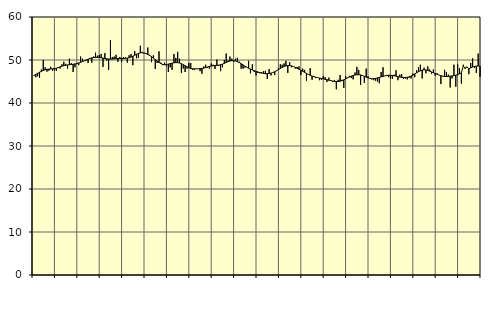
| Category | Piggar | Series 1 |
|---|---|---|
| nan | 46.3 | 46.41 |
| 1.0 | 46 | 46.67 |
| 1.0 | 46.2 | 46.9 |
| 1.0 | 45.9 | 47.15 |
| 1.0 | 47.8 | 47.38 |
| 1.0 | 50 | 47.58 |
| 1.0 | 48.3 | 47.73 |
| 1.0 | 47.3 | 47.82 |
| 1.0 | 47.5 | 47.88 |
| 1.0 | 48.4 | 47.91 |
| 1.0 | 47.5 | 47.94 |
| 1.0 | 47.6 | 48 |
| nan | 47.5 | 48.1 |
| 2.0 | 48.3 | 48.24 |
| 2.0 | 48 | 48.4 |
| 2.0 | 49 | 48.56 |
| 2.0 | 49.6 | 48.69 |
| 2.0 | 49.1 | 48.78 |
| 2.0 | 48 | 48.84 |
| 2.0 | 50.3 | 48.89 |
| 2.0 | 49.3 | 48.94 |
| 2.0 | 47.2 | 49.01 |
| 2.0 | 48.3 | 49.09 |
| 2.0 | 49.3 | 49.19 |
| nan | 48.8 | 49.32 |
| 3.0 | 50.8 | 49.46 |
| 3.0 | 50.3 | 49.64 |
| 3.0 | 49.9 | 49.82 |
| 3.0 | 49.9 | 50 |
| 3.0 | 49.3 | 50.19 |
| 3.0 | 50.3 | 50.36 |
| 3.0 | 49.4 | 50.49 |
| 3.0 | 50.8 | 50.57 |
| 3.0 | 51.7 | 50.61 |
| 3.0 | 51 | 50.62 |
| 3.0 | 51.2 | 50.59 |
| nan | 51.4 | 50.53 |
| 4.0 | 48.4 | 50.45 |
| 4.0 | 51.6 | 50.36 |
| 4.0 | 49.9 | 50.28 |
| 4.0 | 47.7 | 50.23 |
| 4.0 | 54.6 | 50.21 |
| 4.0 | 50.7 | 50.22 |
| 4.0 | 50.8 | 50.26 |
| 4.0 | 51.2 | 50.3 |
| 4.0 | 49.6 | 50.34 |
| 4.0 | 50.7 | 50.37 |
| 4.0 | 49.6 | 50.37 |
| nan | 50.7 | 50.36 |
| 5.0 | 50.6 | 50.38 |
| 5.0 | 49.4 | 50.43 |
| 5.0 | 51.1 | 50.52 |
| 5.0 | 51.4 | 50.68 |
| 5.0 | 48.8 | 50.88 |
| 5.0 | 52.1 | 51.11 |
| 5.0 | 50.4 | 51.34 |
| 5.0 | 50.5 | 51.53 |
| 5.0 | 53.3 | 51.65 |
| 5.0 | 51.9 | 51.69 |
| 5.0 | 51.5 | 51.64 |
| nan | 51.4 | 51.5 |
| 6.0 | 52.9 | 51.3 |
| 6.0 | 51.2 | 51.05 |
| 6.0 | 49.5 | 50.77 |
| 6.0 | 51.1 | 50.45 |
| 6.0 | 47.9 | 50.11 |
| 6.0 | 49.3 | 49.76 |
| 6.0 | 52 | 49.43 |
| 6.0 | 49.4 | 49.16 |
| 6.0 | 48.8 | 48.99 |
| 6.0 | 49.4 | 48.92 |
| 6.0 | 48.5 | 48.95 |
| nan | 47.2 | 49.05 |
| 7.0 | 48.3 | 49.17 |
| 7.0 | 47.7 | 49.27 |
| 7.0 | 51.4 | 49.35 |
| 7.0 | 50.5 | 49.4 |
| 7.0 | 51.9 | 49.38 |
| 7.0 | 50.3 | 49.3 |
| 7.0 | 47 | 49.14 |
| 7.0 | 48 | 48.92 |
| 7.0 | 47.2 | 48.66 |
| 7.0 | 48 | 48.41 |
| 7.0 | 49.3 | 48.19 |
| nan | 49.3 | 48.04 |
| 8.0 | 47.7 | 47.96 |
| 8.0 | 47.7 | 47.94 |
| 8.0 | 47.9 | 47.95 |
| 8.0 | 47.9 | 47.96 |
| 8.0 | 47.4 | 47.99 |
| 8.0 | 46.8 | 48.03 |
| 8.0 | 48.5 | 48.1 |
| 8.0 | 48.9 | 48.23 |
| 8.0 | 48.2 | 48.37 |
| 8.0 | 48 | 48.5 |
| 8.0 | 49.2 | 48.6 |
| nan | 48.9 | 48.67 |
| 9.0 | 47.9 | 48.72 |
| 9.0 | 50.1 | 48.76 |
| 9.0 | 48.6 | 48.81 |
| 9.0 | 47.4 | 48.9 |
| 9.0 | 48.3 | 49.04 |
| 9.0 | 50 | 49.22 |
| 9.0 | 51.5 | 49.43 |
| 9.0 | 49.9 | 49.62 |
| 9.0 | 50.8 | 49.76 |
| 9.0 | 50.3 | 49.84 |
| 9.0 | 49.6 | 49.84 |
| nan | 50.3 | 49.77 |
| 10.0 | 50.5 | 49.62 |
| 10.0 | 49.6 | 49.41 |
| 10.0 | 48 | 49.15 |
| 10.0 | 48 | 48.87 |
| 10.0 | 48.2 | 48.58 |
| 10.0 | 48.3 | 48.32 |
| 10.0 | 49.8 | 48.09 |
| 10.0 | 46.9 | 47.88 |
| 10.0 | 49 | 47.69 |
| 10.0 | 47.2 | 47.52 |
| 10.0 | 46.4 | 47.36 |
| nan | 47 | 47.22 |
| 11.0 | 46.9 | 47.08 |
| 11.0 | 47.2 | 46.96 |
| 11.0 | 47.4 | 46.87 |
| 11.0 | 47.5 | 46.82 |
| 11.0 | 45.6 | 46.82 |
| 11.0 | 47.9 | 46.86 |
| 11.0 | 46.4 | 46.95 |
| 11.0 | 47.1 | 47.09 |
| 11.0 | 46.5 | 47.28 |
| 11.0 | 47.6 | 47.51 |
| 11.0 | 48.1 | 47.77 |
| nan | 49 | 48.04 |
| 12.0 | 48.9 | 48.29 |
| 12.0 | 49.2 | 48.49 |
| 12.0 | 49.8 | 48.63 |
| 12.0 | 47 | 48.71 |
| 12.0 | 49.5 | 48.7 |
| 12.0 | 48.3 | 48.62 |
| 12.0 | 48.5 | 48.48 |
| 12.0 | 48 | 48.29 |
| 12.0 | 48.4 | 48.07 |
| 12.0 | 48.5 | 47.84 |
| 12.0 | 46.5 | 47.61 |
| nan | 48 | 47.37 |
| 13.0 | 47.7 | 47.13 |
| 13.0 | 45.2 | 46.89 |
| 13.0 | 46.7 | 46.66 |
| 13.0 | 48.1 | 46.45 |
| 13.0 | 45.4 | 46.27 |
| 13.0 | 46.3 | 46.11 |
| 13.0 | 45.8 | 45.99 |
| 13.0 | 45.9 | 45.9 |
| 13.0 | 45.3 | 45.81 |
| 13.0 | 45.4 | 45.71 |
| 13.0 | 46.3 | 45.61 |
| nan | 46 | 45.51 |
| 14.0 | 44.9 | 45.41 |
| 14.0 | 45.9 | 45.3 |
| 14.0 | 45.3 | 45.2 |
| 14.0 | 44.9 | 45.11 |
| 14.0 | 45.3 | 45.04 |
| 14.0 | 43.2 | 45.01 |
| 14.0 | 45.4 | 45.01 |
| 14.0 | 46.5 | 45.06 |
| 14.0 | 45.4 | 45.19 |
| 14.0 | 43.5 | 45.38 |
| 14.0 | 46.3 | 45.61 |
| nan | 45.9 | 45.84 |
| 15.0 | 46.3 | 46.06 |
| 15.0 | 45.8 | 46.25 |
| 15.0 | 45.5 | 46.4 |
| 15.0 | 47.1 | 46.51 |
| 15.0 | 48.4 | 46.57 |
| 15.0 | 47.7 | 46.58 |
| 15.0 | 44.2 | 46.53 |
| 15.0 | 46.5 | 46.4 |
| 15.0 | 44.7 | 46.22 |
| 15.0 | 48 | 46.02 |
| 15.0 | 46.2 | 45.85 |
| nan | 45.7 | 45.71 |
| 16.0 | 45.5 | 45.65 |
| 16.0 | 45.3 | 45.66 |
| 16.0 | 45.2 | 45.72 |
| 16.0 | 45 | 45.83 |
| 16.0 | 44.6 | 45.95 |
| 16.0 | 47.2 | 46.07 |
| 16.0 | 48.3 | 46.19 |
| 16.0 | 46.3 | 46.31 |
| 16.0 | 46.5 | 46.4 |
| 16.0 | 46 | 46.45 |
| 16.0 | 45.7 | 46.44 |
| nan | 45.6 | 46.4 |
| 17.0 | 46.6 | 46.33 |
| 17.0 | 47.6 | 46.24 |
| 17.0 | 45.3 | 46.14 |
| 17.0 | 46.6 | 46.05 |
| 17.0 | 46.7 | 45.97 |
| 17.0 | 45.6 | 45.93 |
| 17.0 | 45.7 | 45.93 |
| 17.0 | 45.5 | 45.98 |
| 17.0 | 45.9 | 46.08 |
| 17.0 | 45.7 | 46.26 |
| 17.0 | 46.8 | 46.49 |
| nan | 46 | 46.76 |
| 18.0 | 47.6 | 47.04 |
| 18.0 | 48.3 | 47.29 |
| 18.0 | 48.9 | 47.5 |
| 18.0 | 45.7 | 47.65 |
| 18.0 | 48.2 | 47.72 |
| 18.0 | 46.9 | 47.68 |
| 18.0 | 48.5 | 47.57 |
| 18.0 | 47.8 | 47.41 |
| 18.0 | 46.8 | 47.23 |
| 18.0 | 47.8 | 47.04 |
| 18.0 | 46.3 | 46.85 |
| nan | 46.9 | 46.67 |
| 19.0 | 46.5 | 46.5 |
| 19.0 | 44.4 | 46.35 |
| 19.0 | 46.3 | 46.23 |
| 19.0 | 47.7 | 46.17 |
| 19.0 | 47.2 | 46.15 |
| 19.0 | 46.6 | 46.18 |
| 19.0 | 43.6 | 46.24 |
| 19.0 | 45.7 | 46.3 |
| 19.0 | 48.9 | 46.37 |
| 19.0 | 43.8 | 46.48 |
| 19.0 | 49 | 46.6 |
| nan | 48.1 | 46.78 |
| 20.0 | 44.5 | 47.01 |
| 20.0 | 48.9 | 48.6 |
| 20.0 | 47.9 | 48.12 |
| 20.0 | 48.3 | 48.41 |
| 20.0 | 46.7 | 47.95 |
| 20.0 | 49.3 | 48.17 |
| 20.0 | 50.4 | 48.36 |
| 20.0 | 48.2 | 48.5 |
| 20.0 | 47 | 48.58 |
| 20.0 | 51.5 | 48.6 |
| 20.0 | 46.1 | 48.58 |